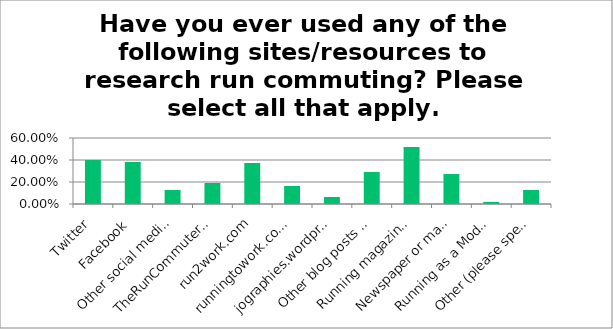
| Category | Responses |
|---|---|
| Twitter | 0.4 |
| Facebook | 0.382 |
| Other social media platforms | 0.127 |
| TheRunCommuter.com | 0.191 |
| run2work.com | 0.373 |
| runningtowork.co.uk | 0.164 |
| jographies.wordpress.com | 0.064 |
| Other blog posts about run commuting | 0.291 |
| Running magazine articles | 0.518 |
| Newspaper or magazine articles about run commuting | 0.273 |
| Running as a Mode of Transportation: General Guidelines | 0.018 |
| Other (please specify) | 0.127 |